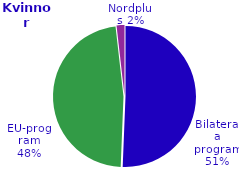
| Category | Series 0 |
|---|---|
| Bilaterala program | 2272 |
| EU-program | 2134 |
| Nordplus | 81 |